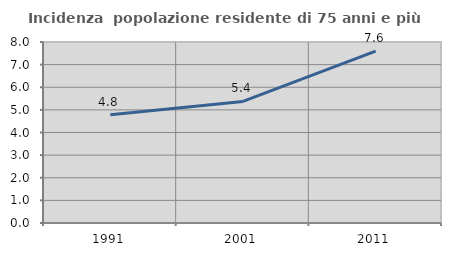
| Category | Incidenza  popolazione residente di 75 anni e più |
|---|---|
| 1991.0 | 4.783 |
| 2001.0 | 5.374 |
| 2011.0 | 7.6 |